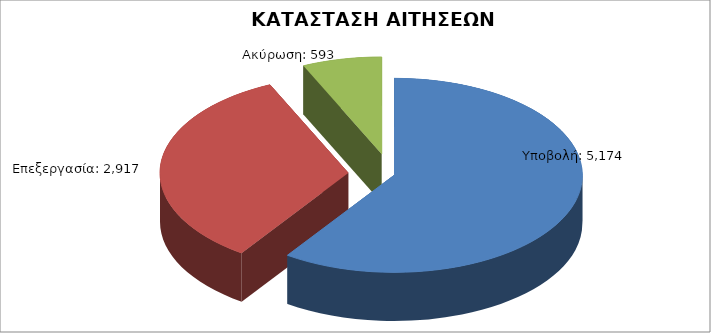
| Category | Series 0 |
|---|---|
| Υποβολή: | 5174 |
| Επεξεργασία: | 2917 |
| Ακύρωση: | 593 |